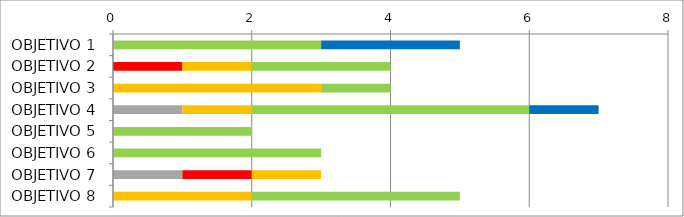
| Category | Series 0 | Series 1 | Series 2 | Series 3 | Series 4 |
|---|---|---|---|---|---|
| OBJETIVO 1 | 0 | 0 | 0 | 3 | 2 |
| OBJETIVO 2 | 0 | 1 | 1 | 2 | 0 |
| OBJETIVO 3 | 0 | 0 | 3 | 1 | 0 |
| OBJETIVO 4 | 1 | 0 | 1 | 4 | 1 |
| OBJETIVO 5 | 0 | 0 | 0 | 2 | 0 |
| OBJETIVO 6 | 0 | 0 | 0 | 3 | 0 |
| OBJETIVO 7 | 1 | 1 | 1 | 0 | 0 |
| OBJETIVO 8 | 0 | 0 | 2 | 3 | 0 |